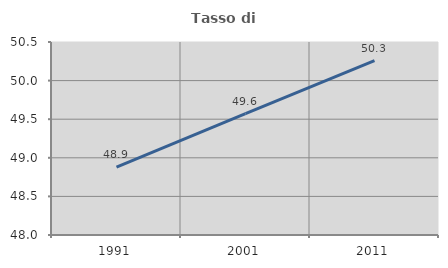
| Category | Tasso di occupazione   |
|---|---|
| 1991.0 | 48.88 |
| 2001.0 | 49.571 |
| 2011.0 | 50.258 |